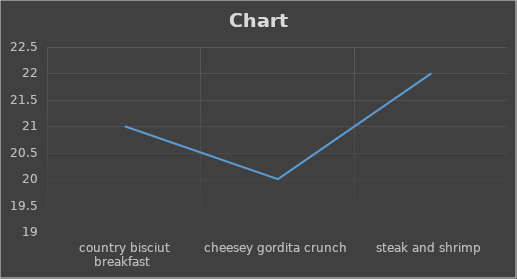
| Category | Series 0 |
|---|---|
| country bisciut breakfast  | 21 |
| cheesey gordita crunch | 20 |
| steak and shrimp | 22 |